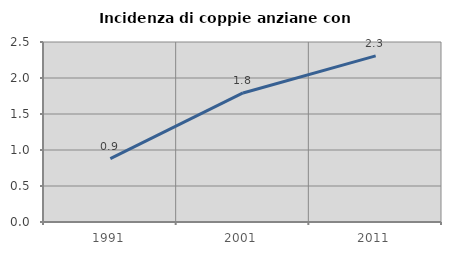
| Category | Incidenza di coppie anziane con figli |
|---|---|
| 1991.0 | 0.881 |
| 2001.0 | 1.793 |
| 2011.0 | 2.307 |